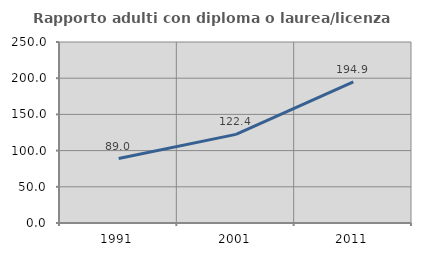
| Category | Rapporto adulti con diploma o laurea/licenza media  |
|---|---|
| 1991.0 | 88.973 |
| 2001.0 | 122.377 |
| 2011.0 | 194.881 |